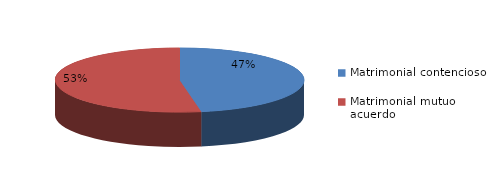
| Category | Series 0 |
|---|---|
| 0 | 1909 |
| 1 | 2134 |